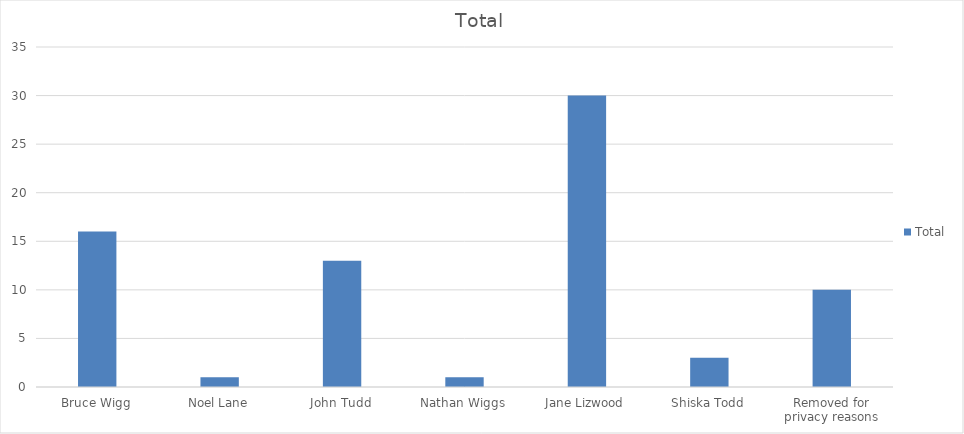
| Category | Total |
|---|---|
| Bruce Wigg | 16 |
| Noel Lane | 1 |
| John Tudd | 13 |
| Nathan Wiggs | 1 |
| Jane Lizwood | 30 |
| Shiska Todd | 3 |
| Removed for privacy reasons | 10 |